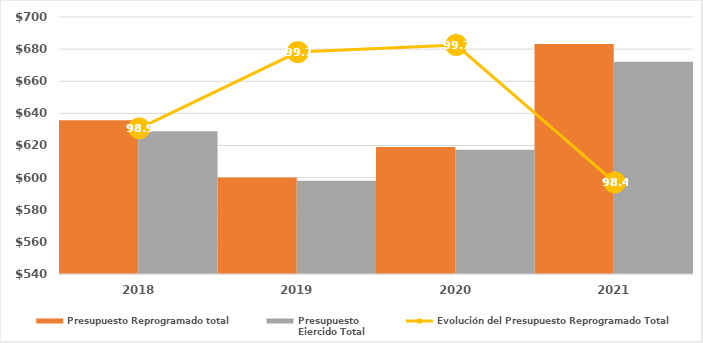
| Category | Presupuesto Reprogramado total | Presupuesto
Ejercido Total |
|---|---|---|
| 2018.0 | 635684.884 | 628799.563 |
| 2019.0 | 600089.527 | 598040.902 |
| 2020.0 | 619034.656 | 617347.742 |
| 2021.0 | 683166.418 | 672172.234 |